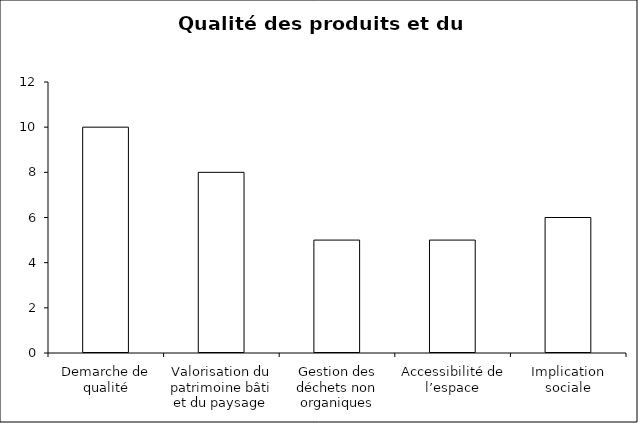
| Category | Series 0 | Series 1 |
|---|---|---|
| Demarche de qualité | 0 | 10 |
| Valorisation du patrimoine bâti et du paysage | 0 | 8 |
| Gestion des déchets non organiques | 0 | 5 |
| Accessibilité de l’espace | 0 | 5 |
| Implication sociale | 0 | 6 |